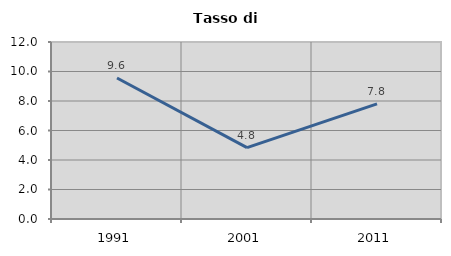
| Category | Tasso di disoccupazione   |
|---|---|
| 1991.0 | 9.561 |
| 2001.0 | 4.835 |
| 2011.0 | 7.806 |